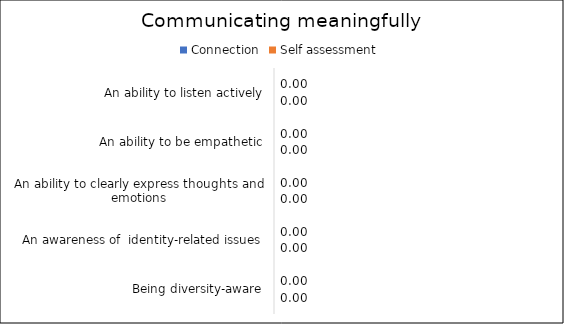
| Category | Connection | Self assessment |
|---|---|---|
| An ability to listen actively | 0 | 0 |
| An ability to be empathetic | 0 | 0 |
| An ability to clearly express thoughts and emotions | 0 | 0 |
| An awareness of  identity-related issues | 0 | 0 |
| Being diversity-aware | 0 | 0 |